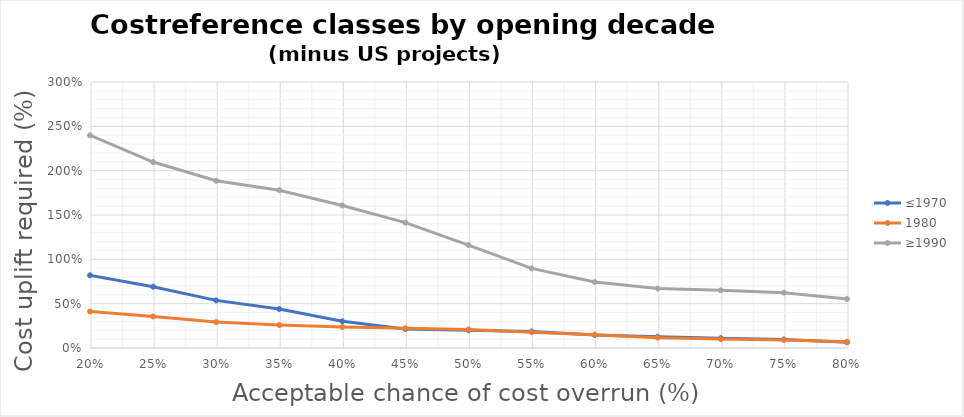
| Category | ≤1970 | 1980 | ≥1990 |
|---|---|---|---|
| 0.8 | 0.065 | 0.071 | 0.553 |
| 0.75 | 0.096 | 0.09 | 0.624 |
| 0.7 | 0.111 | 0.101 | 0.65 |
| 0.65 | 0.126 | 0.116 | 0.672 |
| 0.6 | 0.147 | 0.15 | 0.745 |
| 0.55 | 0.187 | 0.178 | 0.898 |
| 0.5 | 0.2 | 0.21 | 1.161 |
| 0.45 | 0.216 | 0.222 | 1.414 |
| 0.399999999999999 | 0.301 | 0.237 | 1.607 |
| 0.349999999999999 | 0.44 | 0.259 | 1.779 |
| 0.299999999999999 | 0.537 | 0.292 | 1.886 |
| 0.249999999999999 | 0.691 | 0.356 | 2.097 |
| 0.199999999999999 | 0.821 | 0.412 | 2.399 |